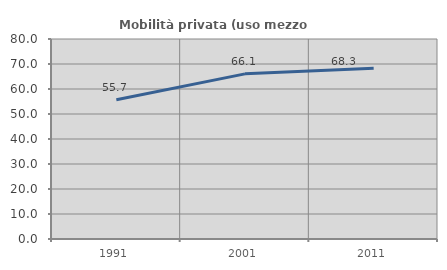
| Category | Mobilità privata (uso mezzo privato) |
|---|---|
| 1991.0 | 55.682 |
| 2001.0 | 66.059 |
| 2011.0 | 68.276 |